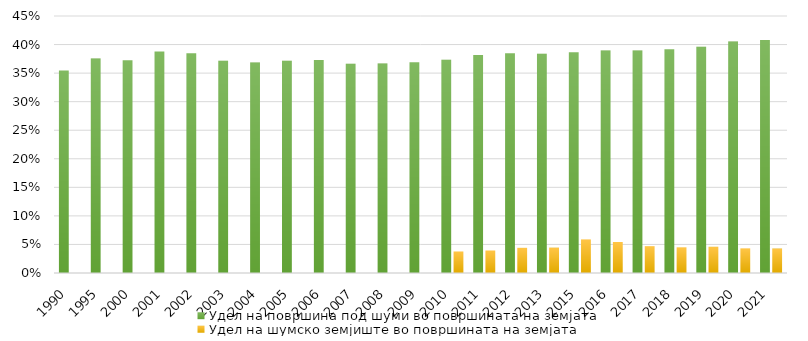
| Category | Удел на површина под шуми во површината на земјата | Удел на шумско земјиште во површината на земјата |
|---|---|---|
| 1990.0 | 0.355 | 0 |
| 1995.0 | 0.376 | 0 |
| 2000.0 | 0.372 | 0 |
| 2001.0 | 0.388 | 0 |
| 2002.0 | 0.385 | 0 |
| 2003.0 | 0.372 | 0 |
| 2004.0 | 0.369 | 0 |
| 2005.0 | 0.371 | 0 |
| 2006.0 | 0.373 | 0 |
| 2007.0 | 0.366 | 0 |
| 2008.0 | 0.367 | 0 |
| 2009.0 | 0.369 | 0 |
| 2010.0 | 0.374 | 0.038 |
| 2011.0 | 0.382 | 0.039 |
| 2012.0 | 0.385 | 0.044 |
| 2013.0 | 0.384 | 0.044 |
| 2015.0 | 0.387 | 0.059 |
| 2016.0 | 0.39 | 0.054 |
| 2017.0 | 0.389 | 0.047 |
| 2018.0 | 0.392 | 0.045 |
| 2019.0 | 0.396 | 0.046 |
| 2020.0 | 0.405 | 0.043 |
| 2021.0 | 0.408 | 0.043 |